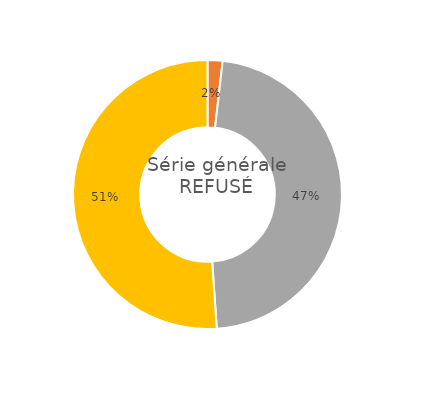
| Category | Series 0 |
|---|---|
| ... ayant validé la maîtrise du socle, et obtenu une moyenne aux épreuves terminales supérieure ou égale à 10/20 | 0 |
| ... n'ayant pas validé la maîtrise du socle, et obtenu une moyenne aux épreuves terminales supérieure ou égale à 10/20 | 1.8 |
| ... ayant validé la maîtrise du socle, et obtenu une moyenne aux épreuves terminales inférieure à 10/20 | 47.1 |
| ... n'ayant pas validé la maîtrise du socle, et obtenu une moyenne aux épreuves terminales inférieure à 10/20 | 51.1 |